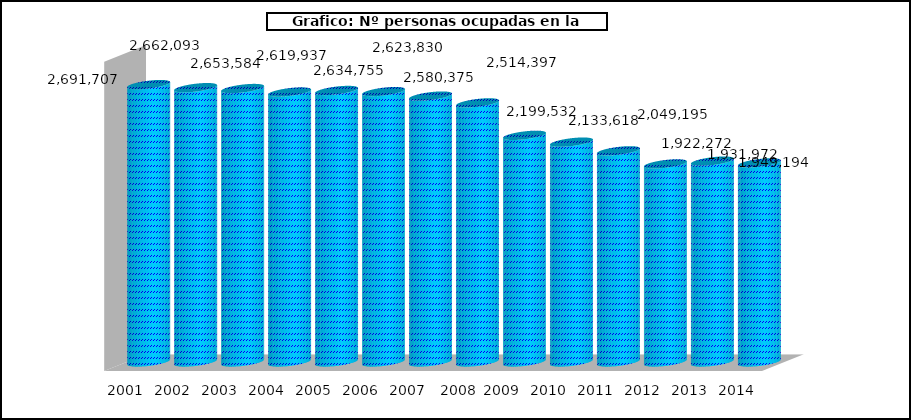
| Category |  Nº personas ocupadas |
|---|---|
| 2001 | 2691707 |
| 2002 | 2662093 |
| 2003 | 2653584 |
| 2004 | 2619937 |
| 2005 | 2634755 |
| 2006 | 2623830 |
| 2007 | 2580375 |
|  2008 * | 2514397 |
| 2009 | 2199532 |
| 2010 | 2133618 |
| 2011 | 2049195 |
| 2012 | 1922272 |
| 2013 | 1949194 |
| 2014 | 1931972 |